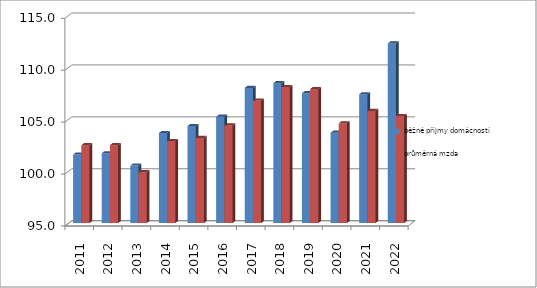
| Category | běžné příjmy domácností | průměrná mzda |
|---|---|---|
| 2011.0 | 101.598 | 102.5 |
| 2012.0 | 101.722 | 102.5 |
| 2013.0 | 100.531 | 99.9 |
| 2014.0 | 103.668 | 102.9 |
| 2015.0 | 104.341 | 103.2 |
| 2016.0 | 105.238 | 104.4 |
| 2017.0 | 108.015 | 106.8 |
| 2018.0 | 108.472 | 108.1 |
| 2019.0 | 107.5 | 107.9 |
| 2020.0 | 103.7 | 104.6 |
| 2021.0 | 107.4 | 105.8 |
| 2022.0 | 112.3 | 105.3 |